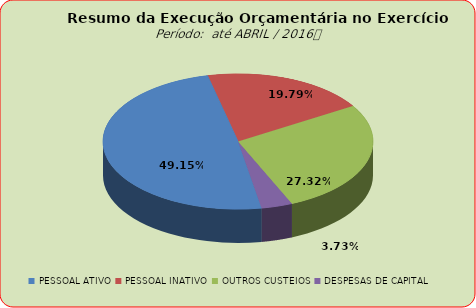
| Category | Series 0 |
|---|---|
| PESSOAL ATIVO | 44006627.73 |
| PESSOAL INATIVO | 17721586.37 |
| OUTROS CUSTEIOS | 24460535.33 |
| DESPESAS DE CAPITAL | 3343175.38 |